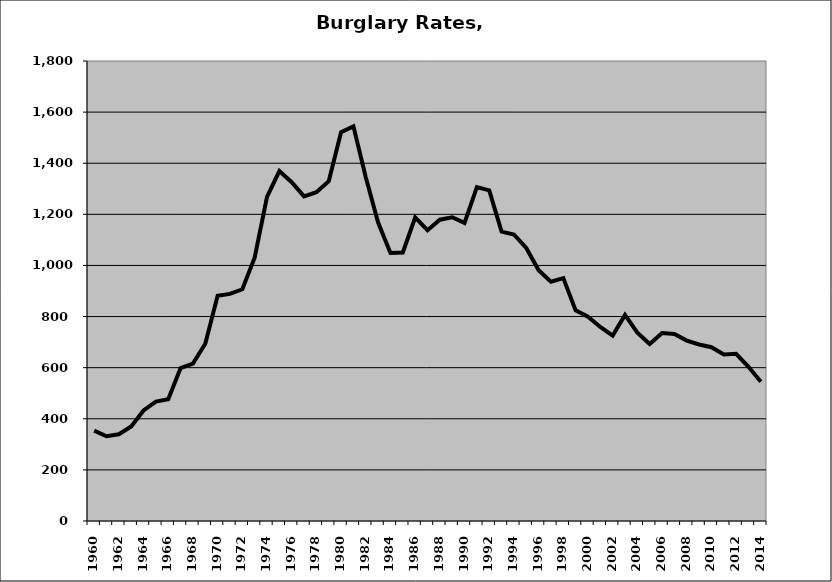
| Category | Burglary |
|---|---|
| 1960.0 | 353.666 |
| 1961.0 | 331.586 |
| 1962.0 | 339.387 |
| 1963.0 | 370.067 |
| 1964.0 | 432.629 |
| 1965.0 | 467.457 |
| 1966.0 | 476.089 |
| 1967.0 | 598.242 |
| 1968.0 | 615.632 |
| 1969.0 | 693.279 |
| 1970.0 | 881.653 |
| 1971.0 | 888.574 |
| 1972.0 | 906.643 |
| 1973.0 | 1030.496 |
| 1974.0 | 1268.59 |
| 1975.0 | 1369.519 |
| 1976.0 | 1325.455 |
| 1977.0 | 1270.378 |
| 1978.0 | 1286.84 |
| 1979.0 | 1329.844 |
| 1980.0 | 1521.414 |
| 1981.0 | 1544.225 |
| 1982.0 | 1344.767 |
| 1983.0 | 1167.753 |
| 1984.0 | 1049.098 |
| 1985.0 | 1050.612 |
| 1986.0 | 1187.688 |
| 1987.0 | 1138.005 |
| 1988.0 | 1178.971 |
| 1989.0 | 1188.659 |
| 1990.0 | 1166.504 |
| 1991.0 | 1306.653 |
| 1992.0 | 1293.658 |
| 1993.0 | 1132.161 |
| 1994.0 | 1121.182 |
| 1995.0 | 1068.382 |
| 1996.0 | 981.299 |
| 1997.0 | 936.108 |
| 1998.0 | 950.323 |
| 1999.0 | 824.174 |
| 2000.0 | 799.132 |
| 2001.0 | 759.18 |
| 2002.0 | 725.689 |
| 2003.0 | 806.412 |
| 2004.0 | 736.951 |
| 2005.0 | 692.388 |
| 2006.0 | 735.4 |
| 2007.0 | 731.665 |
| 2008.0 | 705.769 |
| 2009.0 | 690.839 |
| 2010.0 | 680.098 |
| 2011.0 | 651.898 |
| 2012.0 | 654.121 |
| 2013.0 | 603.495 |
| 2014.0 | 545.037 |